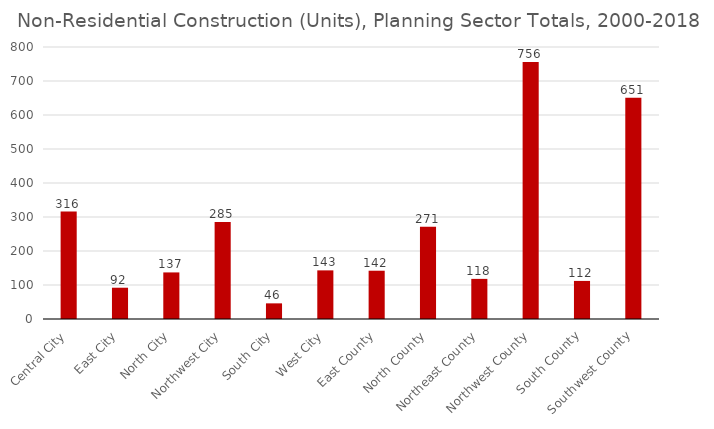
| Category | Non-Residential |
|---|---|
| Central City | 316 |
| East City | 92 |
| North City | 137 |
| Northwest City | 285 |
| South City | 46 |
| West City | 143 |
| East County | 142 |
| North County | 271 |
| Northeast County | 118 |
| Northwest County | 756 |
| South County | 112 |
| Southwest County | 651 |